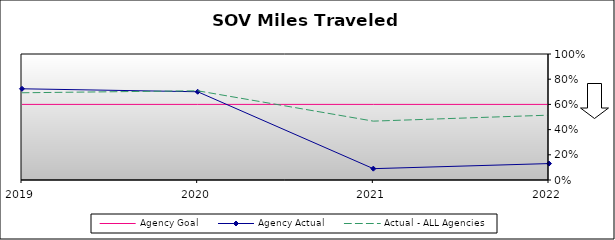
| Category | Agency Goal | Agency Actual | Actual - ALL Agencies |
|---|---|---|---|
| 2019.0 | 0.6 | 0.724 | 0.692 |
| 2020.0 | 0.6 | 0.7 | 0.708 |
| 2021.0 | 0.6 | 0.09 | 0.467 |
| 2022.0 | 0.6 | 0.13 | 0.515 |